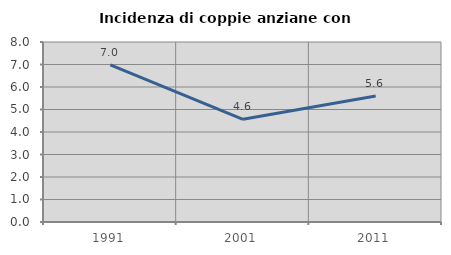
| Category | Incidenza di coppie anziane con figli |
|---|---|
| 1991.0 | 6.987 |
| 2001.0 | 4.564 |
| 2011.0 | 5.603 |